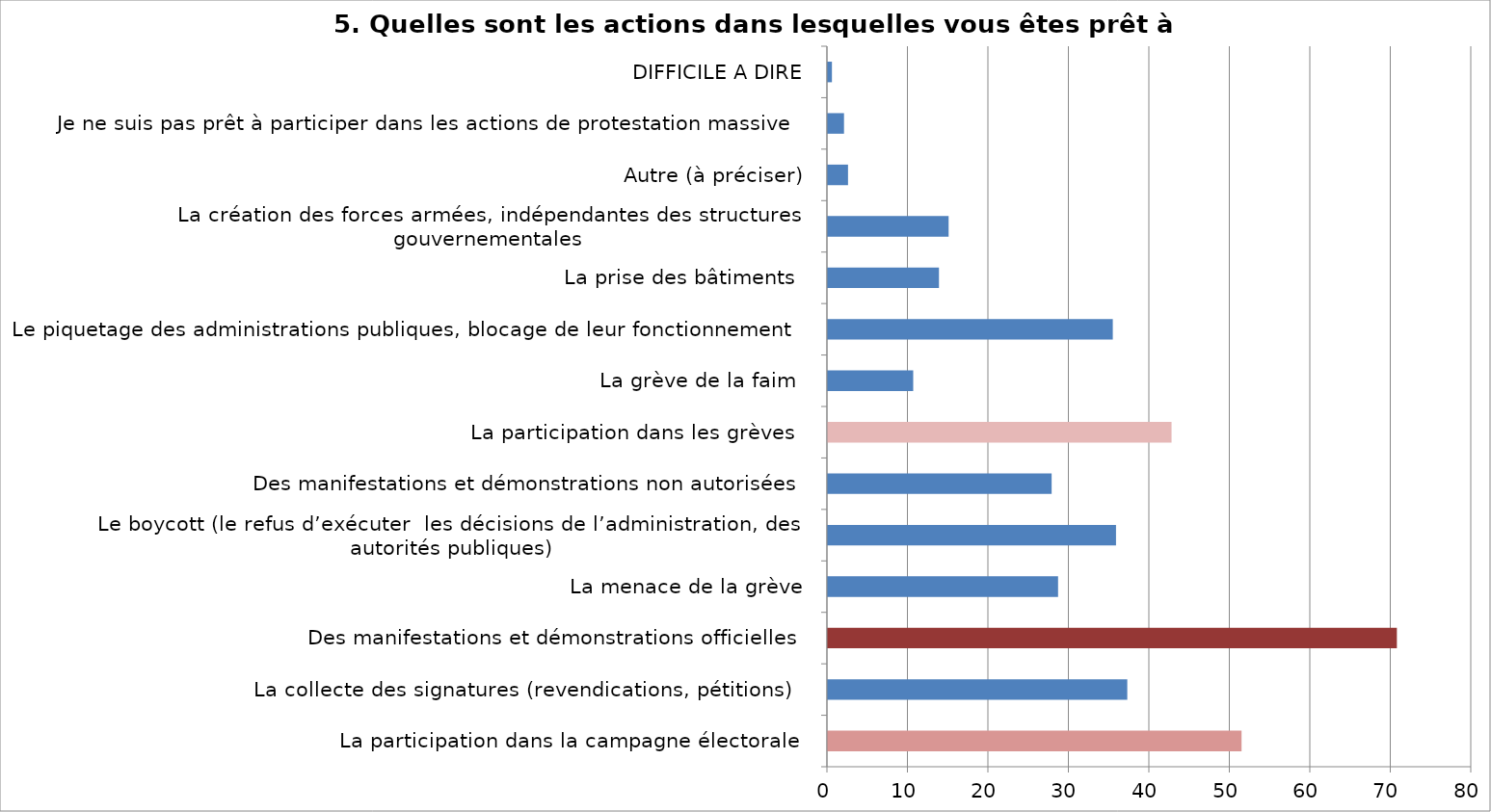
| Category | Series 0 |
|---|---|
| La participation dans la campagne électorale | 51.4 |
| La collecte des signatures (revendications, pétitions)  | 37.2 |
| Des manifestations et démonstrations officielles | 70.7 |
| La menace de la grève | 28.6 |
| Le boycott (le refus d’exécuter  les décisions de l’administration, des autorités publiques) | 35.8 |
| Des manifestations et démonstrations non autorisées | 27.8 |
| La participation dans les grèves  | 42.7 |
| La grève de la faim  | 10.6 |
| Le piquetage des administrations publiques, blocage de leur fonctionnement | 35.4 |
| La prise des bâtiments  | 13.8 |
| La création des forces armées, indépendantes des structures gouvernementales  | 15 |
| Autre (à préciser) | 2.5 |
| Je ne suis pas prêt à participer dans les actions de protestation massive  | 2 |
| DIFFICILE A DIRE | 0.5 |